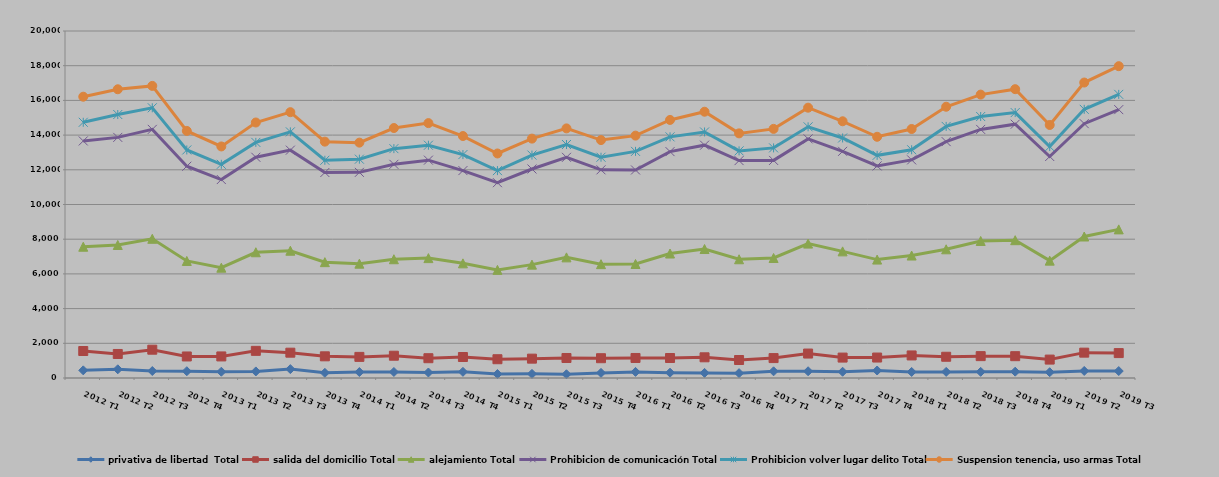
| Category | privativa de libertad  Total | salida del domicilio Total | alejamiento Total | Prohibicion de comunicación Total | Prohibicion volver lugar delito Total | Suspension tenencia, uso armas Total |
|---|---|---|---|---|---|---|
| 2012 T1 | 441 | 1115 | 6010 | 6097 | 1076 | 1474 |
| 2012 T2 | 502 | 883 | 6282 | 6201 | 1318 | 1456 |
| 2012 T3 | 402 | 1229 | 6393 | 6306 | 1244 | 1262 |
| 2012 T4 | 391 | 850 | 5505 | 5460 | 938 | 1097 |
| 2013 T1 | 362 | 881 | 5114 | 5082 | 878 | 1029 |
| 2013 T2 | 379 | 1186 | 5682 | 5476 | 857 | 1146 |
| 2013 T3 | 512 | 947 | 5877 | 5797 | 1053 | 1136 |
| 2013 T4 | 297 | 953 | 5427 | 5168 | 705 | 1073 |
| 2014 T1 | 344 | 873 | 5372 | 5264 | 760 | 953 |
| 2014 T2 | 347 | 937 | 5561 | 5471 | 903 | 1189 |
| 2014 T3 | 317 | 824 | 5769 | 5646 | 860 | 1275 |
| 2014 T4 | 355 | 855 | 5398 | 5347 | 923 | 1068 |
| 2015 T1 | 229 | 853 | 5150 | 5026 | 695 | 988 |
| 2015 T2 | 238 | 877 | 5419 | 5513 | 802 | 948 |
| 2015 T3 | 216 | 937 | 5800 | 5766 | 739 | 929 |
| 2015 T4 | 295 | 846 | 5420 | 5437 | 727 | 988 |
| 2016 T1 | 351 | 803 | 5416 | 5420 | 1072 | 908 |
| 2016 T2 | 306 | 846 | 6022 | 5873 | 852 | 975 |
| 2016 T3 | 295 | 898 | 6241 | 5985 | 762 | 1166 |
| 2016 T4 | 280 | 757 | 5807 | 5686 | 560 | 1010 |
| 2017 T1 | 385 | 763 | 5769 | 5625 | 720 | 1097 |
| 2017 T2 | 389 | 1020 | 6337 | 6036 | 695 | 1103 |
| 2017 T3 | 360 | 817 | 6122 | 5765 | 770 | 963 |
| 2017 T4 | 432 | 747 | 5646 | 5399 | 610 | 1069 |
| 2018 T1 | 350 | 950 | 5758 | 5513 | 585 | 1196 |
| 2018 T2 | 352 | 872 | 6194 | 6206 | 877 | 1133 |
| 2018 T3 | 354 | 906 | 6638 | 6430 | 743 | 1263 |
| 2018 T4 | 364 | 894 | 6685 | 6685 | 670 | 1349 |
| 2019 T1 | 334 | 727 | 5704 | 6003 | 573 | 1243 |
| 2019 T2 | 406 | 1055 | 6694 | 6504 | 827 | 1543 |
| 2019 T3 | 401 | 1035 | 7130 | 6902 | 880 | 1624 |